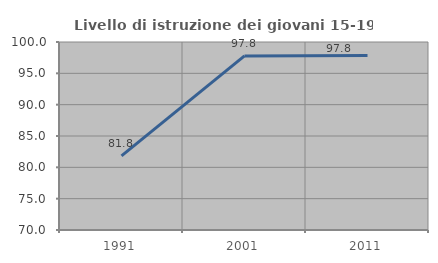
| Category | Livello di istruzione dei giovani 15-19 anni |
|---|---|
| 1991.0 | 81.818 |
| 2001.0 | 97.778 |
| 2011.0 | 97.826 |